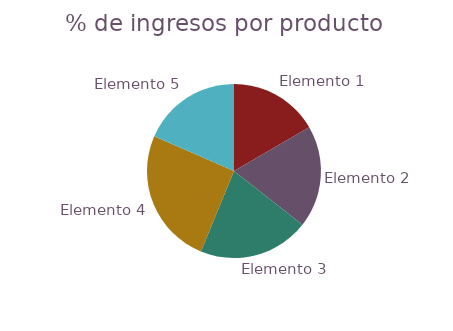
| Category | Total 
Ingresos |
|---|---|
| Elemento 1 | 196.75 |
| Elemento 2 | 224.625 |
| Elemento 3 | 244 |
| Elemento 4 | 300 |
| Elemento 5 | 218.4 |